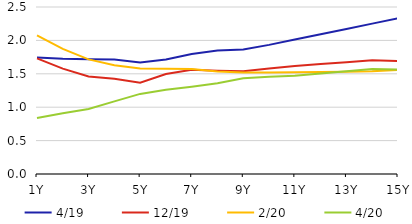
| Category | 4/19 | 12/19 | 2/20 | 4/20 |
|---|---|---|---|---|
|  1Y | 1.742 | 1.732 | 2.075 | 0.838 |
|  2Y | 1.725 | 1.578 | 1.873 | 0.909 |
|  3Y | 1.716 | 1.461 | 1.715 | 0.972 |
|  4Y | 1.713 | 1.425 | 1.629 | 1.087 |
|  5Y | 1.668 | 1.368 | 1.58 | 1.199 |
|  6Y | 1.715 | 1.497 | 1.574 | 1.262 |
|  7Y | 1.795 | 1.561 | 1.572 | 1.307 |
|  8Y | 1.848 | 1.547 | 1.534 | 1.36 |
|  9Y | 1.863 | 1.538 | 1.519 | 1.432 |
|  10Y | 1.933 | 1.579 | 1.519 | 1.455 |
|  11Y | 2.013 | 1.617 | 1.522 | 1.471 |
|  12Y | 2.092 | 1.645 | 1.526 | 1.504 |
|  13Y | 2.172 | 1.673 | 1.531 | 1.537 |
|  14Y | 2.251 | 1.701 | 1.536 | 1.57 |
|  15Y | 2.33 | 1.692 | 1.557 | 1.565 |